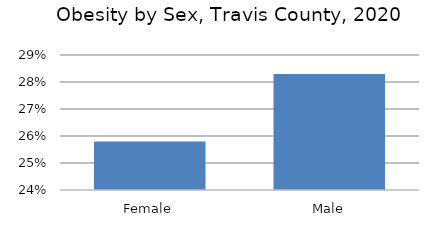
| Category | Series 0 |
|---|---|
| Female | 0.258 |
| Male | 0.283 |